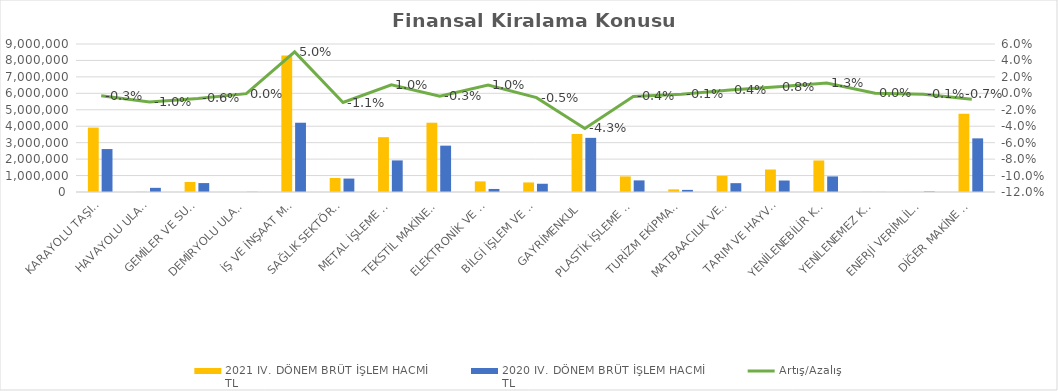
| Category | 2021 IV. DÖNEM BRÜT İŞLEM HACMİ 
TL | 2020 IV. DÖNEM BRÜT İŞLEM HACMİ 
TL |
|---|---|---|
| KARAYOLU TAŞITLARI | 3916219.461 | 2612128.433 |
| HAVAYOLU ULAŞIM ARAÇLARI | 12757 | 252747.655 |
| GEMİLER VE SUDA YÜZEN TAŞIT VE ARAÇLAR | 608730.623 | 542251.666 |
| DEMİRYOLU ULAŞIM ARAÇLARI | 293 | 9618.781 |
| İŞ VE İNŞAAT MAKİNELERİ | 8303718.438 | 4212846.923 |
| SAĞLIK SEKTÖRÜ VE ESTETİK EKİPMANLARI | 852333.211 | 816379.087 |
| METAL İŞLEME MAKİNELERİ | 3333559.734 | 1920726.536 |
| TEKSTİL MAKİNELERİ | 4213277.268 | 2818144.288 |
| ELEKTRONİK VE OPTİK CİHAZLAR | 645205.98 | 185398.943 |
| BİLGİ İŞLEM VE BÜRO SİSTEMLERİ | 581077.583 | 501468.281 |
| GAYRİMENKUL | 3526176.695 | 3293147.226 |
| PLASTİK İŞLEME MAKİNELERİ | 947875.508 | 705956.079 |
| TURİZM EKİPMANLARI | 159181.843 | 128241.207 |
| MATBAACILIK VE KAĞIT İŞLEME MAKİNELERİ | 975066.7 | 537741.094 |
| TARIM VE HAYVANCILIK MAKİNELERİ | 1367215.798 | 699085.684 |
| YENİLENEBİLİR KAYNAKLI ELEKTRİK ENERJİSİ ÜRETİM EKİPMANLARI | 1917311.087 | 948212.463 |
| YENİLENEMEZ KAYNAKLI ELEKTRİK ENERJİSİ ÜRETİM EKİPMANLARI | 12734.067 | 4265.228 |
| ENERJİ VERİMLİLİĞİ EKİPMANLARI | 4127.399 | 28759.345 |
| DİĞER MAKİNE VE EKİPMANLAR | 4757494.876 | 3261438.539 |